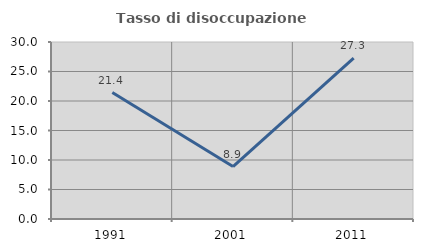
| Category | Tasso di disoccupazione giovanile  |
|---|---|
| 1991.0 | 21.429 |
| 2001.0 | 8.889 |
| 2011.0 | 27.273 |